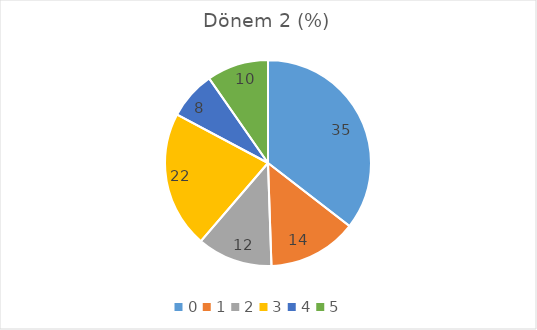
| Category | Dönem 2 (%) |
|---|---|
| 0.0 | 35.484 |
| 1.0 | 13.978 |
| 2.0 | 11.828 |
| 3.0 | 21.505 |
| 4.0 | 7.527 |
| 5.0 | 9.677 |